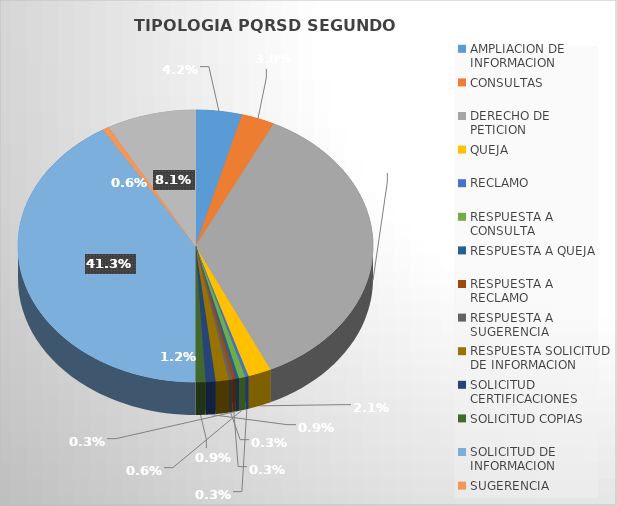
| Category | CANTIDAD |
|---|---|
| AMPLIACION DE INFORMACION | 14 |
| CONSULTAS | 10 |
| DERECHO DE PETICION | 119 |
| QUEJA | 7 |
| RECLAMO | 1 |
| RESPUESTA A CONSULTA | 2 |
| RESPUESTA A QUEJA | 1 |
| RESPUESTA A RECLAMO | 1 |
| RESPUESTA A SUGERENCIA | 1 |
| RESPUESTA SOLICITUD DE INFORMACION | 4 |
| SOLICITUD CERTIFICACIONES | 3 |
| SOLICITUD COPIAS | 3 |
| SOLICITUD DE INFORMACION | 137 |
| SUGERENCIA | 2 |
| TRASLADO PQRS A OTRAS ENTIDADES | 27 |